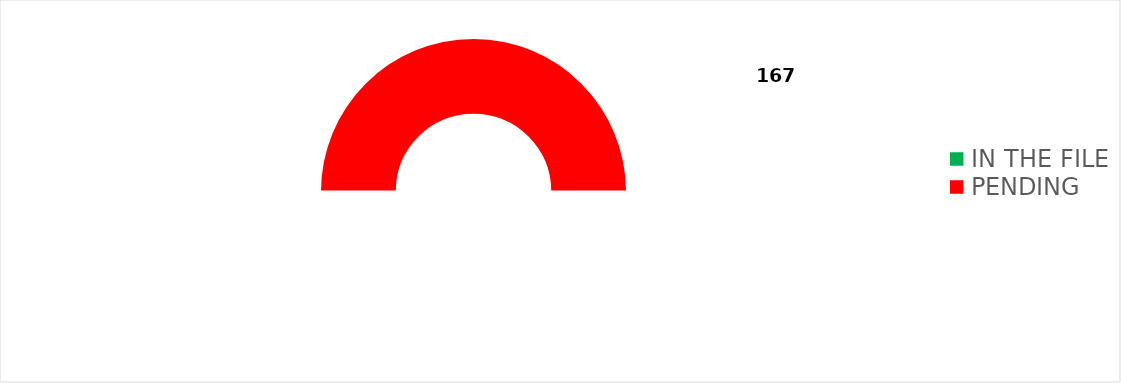
| Category | Series 0 |
|---|---|
| TOTAL | 167 |
| IN THE FILE | 0 |
| PENDING | 167 |